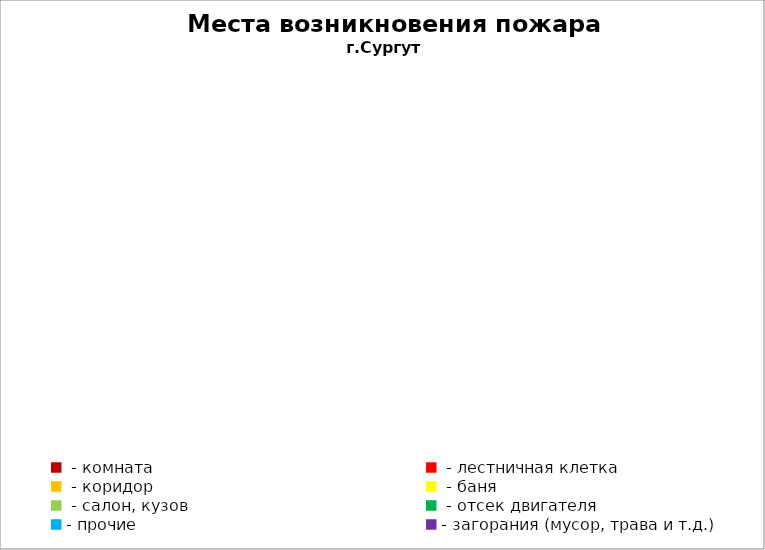
| Category | Места возникновения пожара |
|---|---|
|  - комната | 73 |
|  - лестничная клетка | 15 |
|  - коридор | 11 |
|  - баня | 41 |
|  - салон, кузов | 26 |
|  - отсек двигателя | 46 |
| - прочие | 102 |
| - загорания (мусор, трава и т.д.)  | 162 |